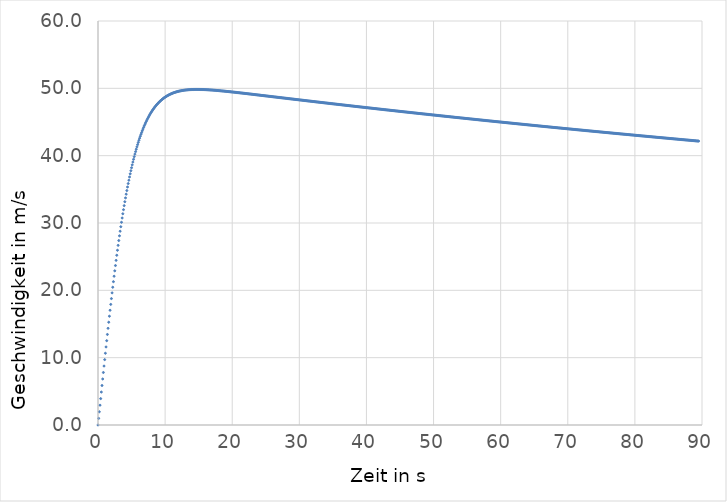
| Category | Series 0 |
|---|---|
| 0.0 | 0 |
| 0.1 | 0.981 |
| 0.2 | 1.962 |
| 0.30000000000000004 | 2.941 |
| 0.4 | 3.919 |
| 0.5 | 4.894 |
| 0.6 | 5.866 |
| 0.7 | 6.834 |
| 0.7999999999999999 | 7.798 |
| 0.8999999999999999 | 8.756 |
| 0.9999999999999999 | 9.709 |
| 1.0999999999999999 | 10.654 |
| 1.2 | 11.593 |
| 1.3 | 12.524 |
| 1.4000000000000001 | 13.446 |
| 1.5000000000000002 | 14.36 |
| 1.6000000000000003 | 15.264 |
| 1.7000000000000004 | 16.158 |
| 1.8000000000000005 | 17.041 |
| 1.9000000000000006 | 17.913 |
| 2.0000000000000004 | 18.774 |
| 2.1000000000000005 | 19.624 |
| 2.2000000000000006 | 20.461 |
| 2.3000000000000007 | 21.285 |
| 2.400000000000001 | 22.096 |
| 2.500000000000001 | 22.895 |
| 2.600000000000001 | 23.679 |
| 2.700000000000001 | 24.451 |
| 2.800000000000001 | 25.208 |
| 2.9000000000000012 | 25.951 |
| 3.0000000000000013 | 26.679 |
| 3.1000000000000014 | 27.393 |
| 3.2000000000000015 | 28.093 |
| 3.3000000000000016 | 28.778 |
| 3.4000000000000017 | 29.448 |
| 3.5000000000000018 | 30.104 |
| 3.600000000000002 | 30.745 |
| 3.700000000000002 | 31.371 |
| 3.800000000000002 | 31.982 |
| 3.900000000000002 | 32.579 |
| 4.000000000000002 | 33.161 |
| 4.100000000000001 | 33.729 |
| 4.200000000000001 | 34.282 |
| 4.300000000000001 | 34.821 |
| 4.4 | 35.345 |
| 4.5 | 35.856 |
| 4.6 | 36.353 |
| 4.699999999999999 | 36.836 |
| 4.799999999999999 | 37.306 |
| 4.899999999999999 | 37.762 |
| 4.999999999999998 | 38.205 |
| 5.099999999999998 | 38.635 |
| 5.1999999999999975 | 39.053 |
| 5.299999999999997 | 39.458 |
| 5.399999999999997 | 39.851 |
| 5.4999999999999964 | 40.232 |
| 5.599999999999996 | 40.601 |
| 5.699999999999996 | 40.958 |
| 5.799999999999995 | 41.305 |
| 5.899999999999995 | 41.64 |
| 5.999999999999995 | 41.964 |
| 6.099999999999994 | 42.278 |
| 6.199999999999994 | 42.582 |
| 6.299999999999994 | 42.875 |
| 6.399999999999993 | 43.159 |
| 6.499999999999993 | 43.433 |
| 6.5999999999999925 | 43.698 |
| 6.699999999999992 | 43.954 |
| 6.799999999999992 | 44.201 |
| 6.8999999999999915 | 44.439 |
| 6.999999999999991 | 44.669 |
| 7.099999999999991 | 44.891 |
| 7.19999999999999 | 45.105 |
| 7.29999999999999 | 45.311 |
| 7.39999999999999 | 45.51 |
| 7.499999999999989 | 45.701 |
| 7.599999999999989 | 45.886 |
| 7.699999999999989 | 46.064 |
| 7.799999999999988 | 46.235 |
| 7.899999999999988 | 46.399 |
| 7.999999999999988 | 46.558 |
| 8.099999999999987 | 46.71 |
| 8.199999999999987 | 46.857 |
| 8.299999999999986 | 46.998 |
| 8.399999999999986 | 47.134 |
| 8.499999999999986 | 47.264 |
| 8.599999999999985 | 47.389 |
| 8.699999999999985 | 47.509 |
| 8.799999999999985 | 47.625 |
| 8.899999999999984 | 47.736 |
| 8.999999999999984 | 47.842 |
| 9.099999999999984 | 47.944 |
| 9.199999999999983 | 48.042 |
| 9.299999999999983 | 48.136 |
| 9.399999999999983 | 48.226 |
| 9.499999999999982 | 48.312 |
| 9.599999999999982 | 48.394 |
| 9.699999999999982 | 48.473 |
| 9.799999999999981 | 48.549 |
| 9.89999999999998 | 48.621 |
| 9.99999999999998 | 48.69 |
| 10.09999999999998 | 48.757 |
| 10.19999999999998 | 48.82 |
| 10.29999999999998 | 48.88 |
| 10.399999999999979 | 48.938 |
| 10.499999999999979 | 48.993 |
| 10.599999999999978 | 49.045 |
| 10.699999999999978 | 49.095 |
| 10.799999999999978 | 49.143 |
| 10.899999999999977 | 49.189 |
| 10.999999999999977 | 49.232 |
| 11.099999999999977 | 49.273 |
| 11.199999999999976 | 49.312 |
| 11.299999999999976 | 49.349 |
| 11.399999999999975 | 49.384 |
| 11.499999999999975 | 49.418 |
| 11.599999999999975 | 49.449 |
| 11.699999999999974 | 49.479 |
| 11.799999999999974 | 49.508 |
| 11.899999999999974 | 49.535 |
| 11.999999999999973 | 49.56 |
| 12.099999999999973 | 49.584 |
| 12.199999999999973 | 49.606 |
| 12.299999999999972 | 49.627 |
| 12.399999999999972 | 49.647 |
| 12.499999999999972 | 49.665 |
| 12.599999999999971 | 49.683 |
| 12.69999999999997 | 49.699 |
| 12.79999999999997 | 49.714 |
| 12.89999999999997 | 49.728 |
| 12.99999999999997 | 49.741 |
| 13.09999999999997 | 49.753 |
| 13.199999999999969 | 49.764 |
| 13.299999999999969 | 49.774 |
| 13.399999999999968 | 49.784 |
| 13.499999999999968 | 49.792 |
| 13.599999999999968 | 49.8 |
| 13.699999999999967 | 49.806 |
| 13.799999999999967 | 49.813 |
| 13.899999999999967 | 49.818 |
| 13.999999999999966 | 49.823 |
| 14.099999999999966 | 49.827 |
| 14.199999999999966 | 49.83 |
| 14.299999999999965 | 49.833 |
| 14.399999999999965 | 49.835 |
| 14.499999999999964 | 49.836 |
| 14.599999999999964 | 49.837 |
| 14.699999999999964 | 49.838 |
| 14.799999999999963 | 49.838 |
| 14.899999999999963 | 49.837 |
| 14.999999999999963 | 49.836 |
| 15.099999999999962 | 49.835 |
| 15.199999999999962 | 49.833 |
| 15.299999999999962 | 49.831 |
| 15.399999999999961 | 49.828 |
| 15.499999999999961 | 49.825 |
| 15.59999999999996 | 49.821 |
| 15.69999999999996 | 49.818 |
| 15.79999999999996 | 49.814 |
| 15.89999999999996 | 49.809 |
| 15.99999999999996 | 49.804 |
| 16.09999999999996 | 49.799 |
| 16.19999999999996 | 49.794 |
| 16.29999999999996 | 49.788 |
| 16.399999999999963 | 49.782 |
| 16.499999999999964 | 49.776 |
| 16.599999999999966 | 49.77 |
| 16.699999999999967 | 49.763 |
| 16.79999999999997 | 49.756 |
| 16.89999999999997 | 49.749 |
| 16.99999999999997 | 49.742 |
| 17.099999999999973 | 49.734 |
| 17.199999999999974 | 49.727 |
| 17.299999999999976 | 49.719 |
| 17.399999999999977 | 49.711 |
| 17.49999999999998 | 49.702 |
| 17.59999999999998 | 49.694 |
| 17.69999999999998 | 49.685 |
| 17.799999999999983 | 49.677 |
| 17.899999999999984 | 49.668 |
| 17.999999999999986 | 49.659 |
| 18.099999999999987 | 49.65 |
| 18.19999999999999 | 49.64 |
| 18.29999999999999 | 49.631 |
| 18.39999999999999 | 49.622 |
| 18.499999999999993 | 49.612 |
| 18.599999999999994 | 49.602 |
| 18.699999999999996 | 49.592 |
| 18.799999999999997 | 49.583 |
| 18.9 | 49.572 |
| 19.0 | 49.562 |
| 19.1 | 49.552 |
| 19.200000000000003 | 49.542 |
| 19.300000000000004 | 49.532 |
| 19.400000000000006 | 49.521 |
| 19.500000000000007 | 49.511 |
| 19.60000000000001 | 49.5 |
| 19.70000000000001 | 49.489 |
| 19.80000000000001 | 49.479 |
| 19.900000000000013 | 49.468 |
| 20.000000000000014 | 49.457 |
| 20.100000000000016 | 49.446 |
| 20.200000000000017 | 49.435 |
| 20.30000000000002 | 49.424 |
| 20.40000000000002 | 49.413 |
| 20.50000000000002 | 49.402 |
| 20.600000000000023 | 49.391 |
| 20.700000000000024 | 49.38 |
| 20.800000000000026 | 49.369 |
| 20.900000000000027 | 49.357 |
| 21.00000000000003 | 49.346 |
| 21.10000000000003 | 49.335 |
| 21.20000000000003 | 49.323 |
| 21.300000000000033 | 49.312 |
| 21.400000000000034 | 49.301 |
| 21.500000000000036 | 49.289 |
| 21.600000000000037 | 49.278 |
| 21.70000000000004 | 49.266 |
| 21.80000000000004 | 49.255 |
| 21.90000000000004 | 49.243 |
| 22.000000000000043 | 49.232 |
| 22.100000000000044 | 49.22 |
| 22.200000000000045 | 49.208 |
| 22.300000000000047 | 49.197 |
| 22.40000000000005 | 49.185 |
| 22.50000000000005 | 49.173 |
| 22.60000000000005 | 49.162 |
| 22.700000000000053 | 49.15 |
| 22.800000000000054 | 49.138 |
| 22.900000000000055 | 49.126 |
| 23.000000000000057 | 49.115 |
| 23.10000000000006 | 49.103 |
| 23.20000000000006 | 49.091 |
| 23.30000000000006 | 49.079 |
| 23.400000000000063 | 49.068 |
| 23.500000000000064 | 49.056 |
| 23.600000000000065 | 49.044 |
| 23.700000000000067 | 49.032 |
| 23.800000000000068 | 49.02 |
| 23.90000000000007 | 49.008 |
| 24.00000000000007 | 48.997 |
| 24.100000000000072 | 48.985 |
| 24.200000000000074 | 48.973 |
| 24.300000000000075 | 48.961 |
| 24.400000000000077 | 48.949 |
| 24.500000000000078 | 48.937 |
| 24.60000000000008 | 48.925 |
| 24.70000000000008 | 48.913 |
| 24.800000000000082 | 48.902 |
| 24.900000000000084 | 48.89 |
| 25.000000000000085 | 48.878 |
| 25.100000000000087 | 48.866 |
| 25.200000000000088 | 48.854 |
| 25.30000000000009 | 48.842 |
| 25.40000000000009 | 48.83 |
| 25.500000000000092 | 48.818 |
| 25.600000000000094 | 48.806 |
| 25.700000000000095 | 48.794 |
| 25.800000000000097 | 48.783 |
| 25.900000000000098 | 48.771 |
| 26.0000000000001 | 48.759 |
| 26.1000000000001 | 48.747 |
| 26.200000000000102 | 48.735 |
| 26.300000000000104 | 48.723 |
| 26.400000000000105 | 48.711 |
| 26.500000000000107 | 48.699 |
| 26.600000000000108 | 48.687 |
| 26.70000000000011 | 48.676 |
| 26.80000000000011 | 48.664 |
| 26.900000000000112 | 48.652 |
| 27.000000000000114 | 48.64 |
| 27.100000000000115 | 48.628 |
| 27.200000000000117 | 48.616 |
| 27.300000000000118 | 48.604 |
| 27.40000000000012 | 48.592 |
| 27.50000000000012 | 48.58 |
| 27.600000000000122 | 48.569 |
| 27.700000000000124 | 48.557 |
| 27.800000000000125 | 48.545 |
| 27.900000000000126 | 48.533 |
| 28.000000000000128 | 48.521 |
| 28.10000000000013 | 48.509 |
| 28.20000000000013 | 48.497 |
| 28.300000000000132 | 48.486 |
| 28.400000000000134 | 48.474 |
| 28.500000000000135 | 48.462 |
| 28.600000000000136 | 48.45 |
| 28.700000000000138 | 48.438 |
| 28.80000000000014 | 48.426 |
| 28.90000000000014 | 48.415 |
| 29.000000000000142 | 48.403 |
| 29.100000000000144 | 48.391 |
| 29.200000000000145 | 48.379 |
| 29.300000000000146 | 48.367 |
| 29.400000000000148 | 48.355 |
| 29.50000000000015 | 48.344 |
| 29.60000000000015 | 48.332 |
| 29.700000000000152 | 48.32 |
| 29.800000000000153 | 48.308 |
| 29.900000000000155 | 48.297 |
| 30.000000000000156 | 48.285 |
| 30.100000000000158 | 48.273 |
| 30.20000000000016 | 48.261 |
| 30.30000000000016 | 48.249 |
| 30.400000000000162 | 48.238 |
| 30.500000000000163 | 48.226 |
| 30.600000000000165 | 48.214 |
| 30.700000000000166 | 48.202 |
| 30.800000000000168 | 48.191 |
| 30.90000000000017 | 48.179 |
| 31.00000000000017 | 48.167 |
| 31.100000000000172 | 48.156 |
| 31.200000000000173 | 48.144 |
| 31.300000000000175 | 48.132 |
| 31.400000000000176 | 48.12 |
| 31.500000000000178 | 48.109 |
| 31.60000000000018 | 48.097 |
| 31.70000000000018 | 48.085 |
| 31.800000000000182 | 48.074 |
| 31.900000000000183 | 48.062 |
| 32.000000000000185 | 48.05 |
| 32.100000000000186 | 48.039 |
| 32.20000000000019 | 48.027 |
| 32.30000000000019 | 48.015 |
| 32.40000000000019 | 48.004 |
| 32.50000000000019 | 47.992 |
| 32.60000000000019 | 47.98 |
| 32.700000000000195 | 47.969 |
| 32.800000000000196 | 47.957 |
| 32.9000000000002 | 47.945 |
| 33.0000000000002 | 47.934 |
| 33.1000000000002 | 47.922 |
| 33.2000000000002 | 47.911 |
| 33.3000000000002 | 47.899 |
| 33.400000000000205 | 47.887 |
| 33.500000000000206 | 47.876 |
| 33.60000000000021 | 47.864 |
| 33.70000000000021 | 47.853 |
| 33.80000000000021 | 47.841 |
| 33.90000000000021 | 47.829 |
| 34.00000000000021 | 47.818 |
| 34.100000000000215 | 47.806 |
| 34.200000000000216 | 47.795 |
| 34.30000000000022 | 47.783 |
| 34.40000000000022 | 47.772 |
| 34.50000000000022 | 47.76 |
| 34.60000000000022 | 47.749 |
| 34.70000000000022 | 47.737 |
| 34.800000000000225 | 47.726 |
| 34.900000000000226 | 47.714 |
| 35.00000000000023 | 47.703 |
| 35.10000000000023 | 47.691 |
| 35.20000000000023 | 47.68 |
| 35.30000000000023 | 47.668 |
| 35.40000000000023 | 47.657 |
| 35.500000000000234 | 47.645 |
| 35.600000000000236 | 47.634 |
| 35.70000000000024 | 47.622 |
| 35.80000000000024 | 47.611 |
| 35.90000000000024 | 47.599 |
| 36.00000000000024 | 47.588 |
| 36.10000000000024 | 47.576 |
| 36.200000000000244 | 47.565 |
| 36.300000000000246 | 47.553 |
| 36.40000000000025 | 47.542 |
| 36.50000000000025 | 47.53 |
| 36.60000000000025 | 47.519 |
| 36.70000000000025 | 47.508 |
| 36.80000000000025 | 47.496 |
| 36.900000000000254 | 47.485 |
| 37.000000000000256 | 47.473 |
| 37.10000000000026 | 47.462 |
| 37.20000000000026 | 47.451 |
| 37.30000000000026 | 47.439 |
| 37.40000000000026 | 47.428 |
| 37.50000000000026 | 47.416 |
| 37.600000000000264 | 47.405 |
| 37.700000000000266 | 47.394 |
| 37.80000000000027 | 47.382 |
| 37.90000000000027 | 47.371 |
| 38.00000000000027 | 47.36 |
| 38.10000000000027 | 47.348 |
| 38.20000000000027 | 47.337 |
| 38.300000000000274 | 47.326 |
| 38.400000000000276 | 47.314 |
| 38.50000000000028 | 47.303 |
| 38.60000000000028 | 47.292 |
| 38.70000000000028 | 47.28 |
| 38.80000000000028 | 47.269 |
| 38.90000000000028 | 47.258 |
| 39.000000000000284 | 47.247 |
| 39.100000000000286 | 47.235 |
| 39.20000000000029 | 47.224 |
| 39.30000000000029 | 47.213 |
| 39.40000000000029 | 47.201 |
| 39.50000000000029 | 47.19 |
| 39.60000000000029 | 47.179 |
| 39.700000000000294 | 47.168 |
| 39.800000000000296 | 47.156 |
| 39.9000000000003 | 47.145 |
| 40.0000000000003 | 47.134 |
| 40.1000000000003 | 47.123 |
| 40.2000000000003 | 47.111 |
| 40.3000000000003 | 47.1 |
| 40.400000000000304 | 47.089 |
| 40.500000000000306 | 47.078 |
| 40.60000000000031 | 47.067 |
| 40.70000000000031 | 47.055 |
| 40.80000000000031 | 47.044 |
| 40.90000000000031 | 47.033 |
| 41.00000000000031 | 47.022 |
| 41.100000000000314 | 47.011 |
| 41.200000000000315 | 46.999 |
| 41.30000000000032 | 46.988 |
| 41.40000000000032 | 46.977 |
| 41.50000000000032 | 46.966 |
| 41.60000000000032 | 46.955 |
| 41.70000000000032 | 46.944 |
| 41.800000000000324 | 46.933 |
| 41.900000000000325 | 46.921 |
| 42.00000000000033 | 46.91 |
| 42.10000000000033 | 46.899 |
| 42.20000000000033 | 46.888 |
| 42.30000000000033 | 46.877 |
| 42.40000000000033 | 46.866 |
| 42.500000000000334 | 46.855 |
| 42.600000000000335 | 46.844 |
| 42.70000000000034 | 46.832 |
| 42.80000000000034 | 46.821 |
| 42.90000000000034 | 46.81 |
| 43.00000000000034 | 46.799 |
| 43.10000000000034 | 46.788 |
| 43.200000000000344 | 46.777 |
| 43.300000000000345 | 46.766 |
| 43.40000000000035 | 46.755 |
| 43.50000000000035 | 46.744 |
| 43.60000000000035 | 46.733 |
| 43.70000000000035 | 46.722 |
| 43.80000000000035 | 46.711 |
| 43.900000000000354 | 46.7 |
| 44.000000000000355 | 46.689 |
| 44.10000000000036 | 46.678 |
| 44.20000000000036 | 46.667 |
| 44.30000000000036 | 46.656 |
| 44.40000000000036 | 46.645 |
| 44.50000000000036 | 46.634 |
| 44.600000000000364 | 46.623 |
| 44.700000000000365 | 46.612 |
| 44.80000000000037 | 46.601 |
| 44.90000000000037 | 46.59 |
| 45.00000000000037 | 46.579 |
| 45.10000000000037 | 46.568 |
| 45.20000000000037 | 46.557 |
| 45.300000000000374 | 46.546 |
| 45.400000000000375 | 46.535 |
| 45.50000000000038 | 46.524 |
| 45.60000000000038 | 46.513 |
| 45.70000000000038 | 46.502 |
| 45.80000000000038 | 46.491 |
| 45.90000000000038 | 46.48 |
| 46.000000000000384 | 46.469 |
| 46.100000000000385 | 46.458 |
| 46.20000000000039 | 46.447 |
| 46.30000000000039 | 46.437 |
| 46.40000000000039 | 46.426 |
| 46.50000000000039 | 46.415 |
| 46.60000000000039 | 46.404 |
| 46.700000000000394 | 46.393 |
| 46.800000000000395 | 46.382 |
| 46.9000000000004 | 46.371 |
| 47.0000000000004 | 46.36 |
| 47.1000000000004 | 46.35 |
| 47.2000000000004 | 46.339 |
| 47.3000000000004 | 46.328 |
| 47.400000000000404 | 46.317 |
| 47.500000000000405 | 46.306 |
| 47.600000000000406 | 46.295 |
| 47.70000000000041 | 46.284 |
| 47.80000000000041 | 46.274 |
| 47.90000000000041 | 46.263 |
| 48.00000000000041 | 46.252 |
| 48.10000000000041 | 46.241 |
| 48.200000000000415 | 46.23 |
| 48.300000000000416 | 46.22 |
| 48.40000000000042 | 46.209 |
| 48.50000000000042 | 46.198 |
| 48.60000000000042 | 46.187 |
| 48.70000000000042 | 46.176 |
| 48.80000000000042 | 46.166 |
| 48.900000000000425 | 46.155 |
| 49.000000000000426 | 46.144 |
| 49.10000000000043 | 46.133 |
| 49.20000000000043 | 46.123 |
| 49.30000000000043 | 46.112 |
| 49.40000000000043 | 46.101 |
| 49.50000000000043 | 46.09 |
| 49.600000000000435 | 46.08 |
| 49.700000000000436 | 46.069 |
| 49.80000000000044 | 46.058 |
| 49.90000000000044 | 46.047 |
| 50.00000000000044 | 46.037 |
| 50.10000000000044 | 46.026 |
| 50.20000000000044 | 46.015 |
| 50.300000000000445 | 46.005 |
| 50.400000000000446 | 45.994 |
| 50.50000000000045 | 45.983 |
| 50.60000000000045 | 45.972 |
| 50.70000000000045 | 45.962 |
| 50.80000000000045 | 45.951 |
| 50.90000000000045 | 45.94 |
| 51.000000000000455 | 45.93 |
| 51.100000000000456 | 45.919 |
| 51.20000000000046 | 45.908 |
| 51.30000000000046 | 45.898 |
| 51.40000000000046 | 45.887 |
| 51.50000000000046 | 45.877 |
| 51.60000000000046 | 45.866 |
| 51.700000000000465 | 45.855 |
| 51.800000000000466 | 45.845 |
| 51.90000000000047 | 45.834 |
| 52.00000000000047 | 45.823 |
| 52.10000000000047 | 45.813 |
| 52.20000000000047 | 45.802 |
| 52.30000000000047 | 45.792 |
| 52.400000000000475 | 45.781 |
| 52.500000000000476 | 45.77 |
| 52.60000000000048 | 45.76 |
| 52.70000000000048 | 45.749 |
| 52.80000000000048 | 45.739 |
| 52.90000000000048 | 45.728 |
| 53.00000000000048 | 45.718 |
| 53.100000000000485 | 45.707 |
| 53.200000000000486 | 45.696 |
| 53.30000000000049 | 45.686 |
| 53.40000000000049 | 45.675 |
| 53.50000000000049 | 45.665 |
| 53.60000000000049 | 45.654 |
| 53.70000000000049 | 45.644 |
| 53.800000000000495 | 45.633 |
| 53.900000000000496 | 45.623 |
| 54.0000000000005 | 45.612 |
| 54.1000000000005 | 45.602 |
| 54.2000000000005 | 45.591 |
| 54.3000000000005 | 45.581 |
| 54.4000000000005 | 45.57 |
| 54.500000000000504 | 45.56 |
| 54.600000000000506 | 45.549 |
| 54.70000000000051 | 45.539 |
| 54.80000000000051 | 45.528 |
| 54.90000000000051 | 45.518 |
| 55.00000000000051 | 45.507 |
| 55.10000000000051 | 45.497 |
| 55.200000000000514 | 45.486 |
| 55.300000000000516 | 45.476 |
| 55.40000000000052 | 45.465 |
| 55.50000000000052 | 45.455 |
| 55.60000000000052 | 45.445 |
| 55.70000000000052 | 45.434 |
| 55.80000000000052 | 45.424 |
| 55.900000000000524 | 45.413 |
| 56.000000000000526 | 45.403 |
| 56.10000000000053 | 45.392 |
| 56.20000000000053 | 45.382 |
| 56.30000000000053 | 45.372 |
| 56.40000000000053 | 45.361 |
| 56.50000000000053 | 45.351 |
| 56.600000000000534 | 45.34 |
| 56.700000000000536 | 45.33 |
| 56.80000000000054 | 45.32 |
| 56.90000000000054 | 45.309 |
| 57.00000000000054 | 45.299 |
| 57.10000000000054 | 45.288 |
| 57.20000000000054 | 45.278 |
| 57.300000000000544 | 45.268 |
| 57.400000000000546 | 45.257 |
| 57.50000000000055 | 45.247 |
| 57.60000000000055 | 45.237 |
| 57.70000000000055 | 45.226 |
| 57.80000000000055 | 45.216 |
| 57.90000000000055 | 45.206 |
| 58.000000000000554 | 45.195 |
| 58.100000000000556 | 45.185 |
| 58.20000000000056 | 45.175 |
| 58.30000000000056 | 45.164 |
| 58.40000000000056 | 45.154 |
| 58.50000000000056 | 45.144 |
| 58.60000000000056 | 45.134 |
| 58.700000000000564 | 45.123 |
| 58.800000000000566 | 45.113 |
| 58.90000000000057 | 45.103 |
| 59.00000000000057 | 45.092 |
| 59.10000000000057 | 45.082 |
| 59.20000000000057 | 45.072 |
| 59.30000000000057 | 45.062 |
| 59.400000000000574 | 45.051 |
| 59.500000000000576 | 45.041 |
| 59.60000000000058 | 45.031 |
| 59.70000000000058 | 45.021 |
| 59.80000000000058 | 45.01 |
| 59.90000000000058 | 45 |
| 60.00000000000058 | 44.99 |
| 60.100000000000584 | 44.98 |
| 60.200000000000585 | 44.969 |
| 60.30000000000059 | 44.959 |
| 60.40000000000059 | 44.949 |
| 60.50000000000059 | 44.939 |
| 60.60000000000059 | 44.929 |
| 60.70000000000059 | 44.918 |
| 60.800000000000594 | 44.908 |
| 60.900000000000595 | 44.898 |
| 61.0000000000006 | 44.888 |
| 61.1000000000006 | 44.878 |
| 61.2000000000006 | 44.868 |
| 61.3000000000006 | 44.857 |
| 61.4000000000006 | 44.847 |
| 61.500000000000604 | 44.837 |
| 61.600000000000605 | 44.827 |
| 61.70000000000061 | 44.817 |
| 61.80000000000061 | 44.807 |
| 61.90000000000061 | 44.796 |
| 62.00000000000061 | 44.786 |
| 62.10000000000061 | 44.776 |
| 62.200000000000614 | 44.766 |
| 62.300000000000615 | 44.756 |
| 62.40000000000062 | 44.746 |
| 62.50000000000062 | 44.736 |
| 62.60000000000062 | 44.726 |
| 62.70000000000062 | 44.715 |
| 62.80000000000062 | 44.705 |
| 62.900000000000624 | 44.695 |
| 63.000000000000625 | 44.685 |
| 63.10000000000063 | 44.675 |
| 63.20000000000063 | 44.665 |
| 63.30000000000063 | 44.655 |
| 63.40000000000063 | 44.645 |
| 63.50000000000063 | 44.635 |
| 63.600000000000634 | 44.625 |
| 63.700000000000635 | 44.615 |
| 63.80000000000064 | 44.605 |
| 63.90000000000064 | 44.595 |
| 64.00000000000064 | 44.585 |
| 64.10000000000063 | 44.575 |
| 64.20000000000063 | 44.564 |
| 64.30000000000062 | 44.554 |
| 64.40000000000062 | 44.544 |
| 64.50000000000061 | 44.534 |
| 64.6000000000006 | 44.524 |
| 64.7000000000006 | 44.514 |
| 64.8000000000006 | 44.504 |
| 64.90000000000059 | 44.494 |
| 65.00000000000058 | 44.484 |
| 65.10000000000058 | 44.474 |
| 65.20000000000057 | 44.464 |
| 65.30000000000057 | 44.454 |
| 65.40000000000056 | 44.444 |
| 65.50000000000055 | 44.434 |
| 65.60000000000055 | 44.424 |
| 65.70000000000054 | 44.415 |
| 65.80000000000054 | 44.405 |
| 65.90000000000053 | 44.395 |
| 66.00000000000053 | 44.385 |
| 66.10000000000052 | 44.375 |
| 66.20000000000051 | 44.365 |
| 66.30000000000051 | 44.355 |
| 66.4000000000005 | 44.345 |
| 66.5000000000005 | 44.335 |
| 66.60000000000049 | 44.325 |
| 66.70000000000049 | 44.315 |
| 66.80000000000048 | 44.305 |
| 66.90000000000047 | 44.295 |
| 67.00000000000047 | 44.285 |
| 67.10000000000046 | 44.275 |
| 67.20000000000046 | 44.266 |
| 67.30000000000045 | 44.256 |
| 67.40000000000045 | 44.246 |
| 67.50000000000044 | 44.236 |
| 67.60000000000043 | 44.226 |
| 67.70000000000043 | 44.216 |
| 67.80000000000042 | 44.206 |
| 67.90000000000042 | 44.196 |
| 68.00000000000041 | 44.187 |
| 68.1000000000004 | 44.177 |
| 68.2000000000004 | 44.167 |
| 68.3000000000004 | 44.157 |
| 68.40000000000039 | 44.147 |
| 68.50000000000038 | 44.137 |
| 68.60000000000038 | 44.127 |
| 68.70000000000037 | 44.118 |
| 68.80000000000037 | 44.108 |
| 68.90000000000036 | 44.098 |
| 69.00000000000036 | 44.088 |
| 69.10000000000035 | 44.078 |
| 69.20000000000034 | 44.069 |
| 69.30000000000034 | 44.059 |
| 69.40000000000033 | 44.049 |
| 69.50000000000033 | 44.039 |
| 69.60000000000032 | 44.029 |
| 69.70000000000032 | 44.02 |
| 69.80000000000031 | 44.01 |
| 69.9000000000003 | 44 |
| 70.0000000000003 | 43.99 |
| 70.10000000000029 | 43.98 |
| 70.20000000000029 | 43.971 |
| 70.30000000000028 | 43.961 |
| 70.40000000000028 | 43.951 |
| 70.50000000000027 | 43.941 |
| 70.60000000000026 | 43.932 |
| 70.70000000000026 | 43.922 |
| 70.80000000000025 | 43.912 |
| 70.90000000000025 | 43.902 |
| 71.00000000000024 | 43.893 |
| 71.10000000000024 | 43.883 |
| 71.20000000000023 | 43.873 |
| 71.30000000000022 | 43.864 |
| 71.40000000000022 | 43.854 |
| 71.50000000000021 | 43.844 |
| 71.60000000000021 | 43.834 |
| 71.7000000000002 | 43.825 |
| 71.8000000000002 | 43.815 |
| 71.90000000000019 | 43.805 |
| 72.00000000000018 | 43.796 |
| 72.10000000000018 | 43.786 |
| 72.20000000000017 | 43.776 |
| 72.30000000000017 | 43.767 |
| 72.40000000000016 | 43.757 |
| 72.50000000000016 | 43.747 |
| 72.60000000000015 | 43.738 |
| 72.70000000000014 | 43.728 |
| 72.80000000000014 | 43.718 |
| 72.90000000000013 | 43.709 |
| 73.00000000000013 | 43.699 |
| 73.10000000000012 | 43.689 |
| 73.20000000000012 | 43.68 |
| 73.30000000000011 | 43.67 |
| 73.4000000000001 | 43.66 |
| 73.5000000000001 | 43.651 |
| 73.6000000000001 | 43.641 |
| 73.70000000000009 | 43.632 |
| 73.80000000000008 | 43.622 |
| 73.90000000000008 | 43.612 |
| 74.00000000000007 | 43.603 |
| 74.10000000000007 | 43.593 |
| 74.20000000000006 | 43.584 |
| 74.30000000000005 | 43.574 |
| 74.40000000000005 | 43.564 |
| 74.50000000000004 | 43.555 |
| 74.60000000000004 | 43.545 |
| 74.70000000000003 | 43.536 |
| 74.80000000000003 | 43.526 |
| 74.90000000000002 | 43.517 |
| 75.00000000000001 | 43.507 |
| 75.10000000000001 | 43.497 |
| 75.2 | 43.488 |
| 75.3 | 43.478 |
| 75.39999999999999 | 43.469 |
| 75.49999999999999 | 43.459 |
| 75.59999999999998 | 43.45 |
| 75.69999999999997 | 43.44 |
| 75.79999999999997 | 43.431 |
| 75.89999999999996 | 43.421 |
| 75.99999999999996 | 43.412 |
| 76.09999999999995 | 43.402 |
| 76.19999999999995 | 43.393 |
| 76.29999999999994 | 43.383 |
| 76.39999999999993 | 43.374 |
| 76.49999999999993 | 43.364 |
| 76.59999999999992 | 43.355 |
| 76.69999999999992 | 43.345 |
| 76.79999999999991 | 43.336 |
| 76.8999999999999 | 43.326 |
| 76.9999999999999 | 43.317 |
| 77.0999999999999 | 43.307 |
| 77.19999999999989 | 43.298 |
| 77.29999999999988 | 43.288 |
| 77.39999999999988 | 43.279 |
| 77.49999999999987 | 43.269 |
| 77.59999999999987 | 43.26 |
| 77.69999999999986 | 43.25 |
| 77.79999999999986 | 43.241 |
| 77.89999999999985 | 43.232 |
| 77.99999999999984 | 43.222 |
| 78.09999999999984 | 43.213 |
| 78.19999999999983 | 43.203 |
| 78.29999999999983 | 43.194 |
| 78.39999999999982 | 43.184 |
| 78.49999999999982 | 43.175 |
| 78.59999999999981 | 43.166 |
| 78.6999999999998 | 43.156 |
| 78.7999999999998 | 43.147 |
| 78.89999999999979 | 43.137 |
| 78.99999999999979 | 43.128 |
| 79.09999999999978 | 43.119 |
| 79.19999999999978 | 43.109 |
| 79.29999999999977 | 43.1 |
| 79.39999999999976 | 43.09 |
| 79.49999999999976 | 43.081 |
| 79.59999999999975 | 43.072 |
| 79.69999999999975 | 43.062 |
| 79.79999999999974 | 43.053 |
| 79.89999999999974 | 43.044 |
| 79.99999999999973 | 43.034 |
| 80.09999999999972 | 43.025 |
| 80.19999999999972 | 43.016 |
| 80.29999999999971 | 43.006 |
| 80.39999999999971 | 42.997 |
| 80.4999999999997 | 42.988 |
| 80.5999999999997 | 42.978 |
| 80.69999999999969 | 42.969 |
| 80.79999999999968 | 42.96 |
| 80.89999999999968 | 42.95 |
| 80.99999999999967 | 42.941 |
| 81.09999999999967 | 42.932 |
| 81.19999999999966 | 42.922 |
| 81.29999999999966 | 42.913 |
| 81.39999999999965 | 42.904 |
| 81.49999999999964 | 42.895 |
| 81.59999999999964 | 42.885 |
| 81.69999999999963 | 42.876 |
| 81.79999999999963 | 42.867 |
| 81.89999999999962 | 42.857 |
| 81.99999999999962 | 42.848 |
| 82.09999999999961 | 42.839 |
| 82.1999999999996 | 42.83 |
| 82.2999999999996 | 42.82 |
| 82.3999999999996 | 42.811 |
| 82.49999999999959 | 42.802 |
| 82.59999999999958 | 42.793 |
| 82.69999999999958 | 42.783 |
| 82.79999999999957 | 42.774 |
| 82.89999999999957 | 42.765 |
| 82.99999999999956 | 42.756 |
| 83.09999999999955 | 42.746 |
| 83.19999999999955 | 42.737 |
| 83.29999999999954 | 42.728 |
| 83.39999999999954 | 42.719 |
| 83.49999999999953 | 42.71 |
| 83.59999999999953 | 42.7 |
| 83.69999999999952 | 42.691 |
| 83.79999999999951 | 42.682 |
| 83.89999999999951 | 42.673 |
| 83.9999999999995 | 42.664 |
| 84.0999999999995 | 42.654 |
| 84.19999999999949 | 42.645 |
| 84.29999999999949 | 42.636 |
| 84.39999999999948 | 42.627 |
| 84.49999999999947 | 42.618 |
| 84.59999999999947 | 42.609 |
| 84.69999999999946 | 42.599 |
| 84.79999999999946 | 42.59 |
| 84.89999999999945 | 42.581 |
| 84.99999999999945 | 42.572 |
| 85.09999999999944 | 42.563 |
| 85.19999999999943 | 42.554 |
| 85.29999999999943 | 42.545 |
| 85.39999999999942 | 42.535 |
| 85.49999999999942 | 42.526 |
| 85.59999999999941 | 42.517 |
| 85.6999999999994 | 42.508 |
| 85.7999999999994 | 42.499 |
| 85.8999999999994 | 42.49 |
| 85.99999999999939 | 42.481 |
| 86.09999999999938 | 42.472 |
| 86.19999999999938 | 42.462 |
| 86.29999999999937 | 42.453 |
| 86.39999999999937 | 42.444 |
| 86.49999999999936 | 42.435 |
| 86.59999999999935 | 42.426 |
| 86.69999999999935 | 42.417 |
| 86.79999999999934 | 42.408 |
| 86.89999999999934 | 42.399 |
| 86.99999999999933 | 42.39 |
| 87.09999999999933 | 42.381 |
| 87.19999999999932 | 42.372 |
| 87.29999999999932 | 42.363 |
| 87.39999999999931 | 42.354 |
| 87.4999999999993 | 42.345 |
| 87.5999999999993 | 42.335 |
| 87.69999999999929 | 42.326 |
| 87.79999999999929 | 42.317 |
| 87.89999999999928 | 42.308 |
| 87.99999999999928 | 42.299 |
| 88.09999999999927 | 42.29 |
| 88.19999999999926 | 42.281 |
| 88.29999999999926 | 42.272 |
| 88.39999999999925 | 42.263 |
| 88.49999999999925 | 42.254 |
| 88.59999999999924 | 42.245 |
| 88.69999999999924 | 42.236 |
| 88.79999999999923 | 42.227 |
| 88.89999999999922 | 42.218 |
| 88.99999999999922 | 42.209 |
| 89.09999999999921 | 42.2 |
| 89.1999999999992 | 42.191 |
| 89.2999999999992 | 42.182 |
| 89.3999999999992 | 42.173 |
| 89.49999999999919 | 42.164 |